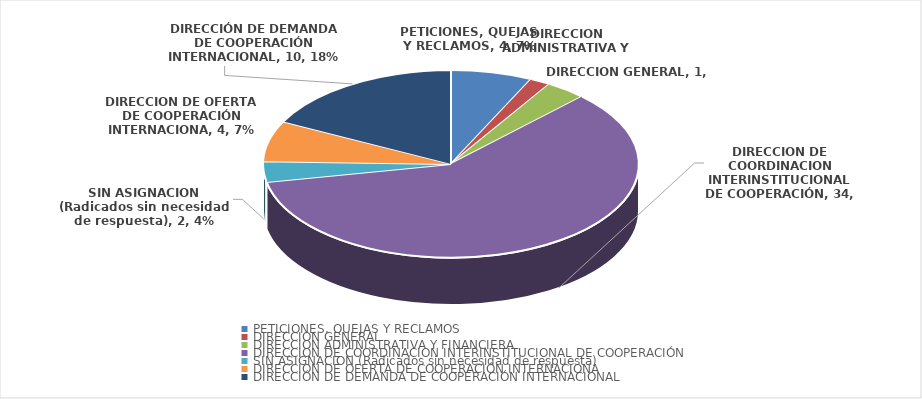
| Category | Series 0 |
|---|---|
| PETICIONES, QUEJAS Y RECLAMOS | 4 |
| DIRECCION GENERAL | 1 |
| DIRECCION ADMINISTRATIVA Y FINANCIERA | 2 |
| DIRECCION DE COORDINACION INTERINSTITUCIONAL DE COOPERACIÓN | 34 |
| SIN ASIGNACION (Radicados sin necesidad de respuesta) | 2 |
| DIRECCION DE OFERTA DE COOPERACIÓN INTERNACIONA | 4 |
| DIRECCIÓN DE DEMANDA DE COOPERACIÓN INTERNACIONAL | 10 |